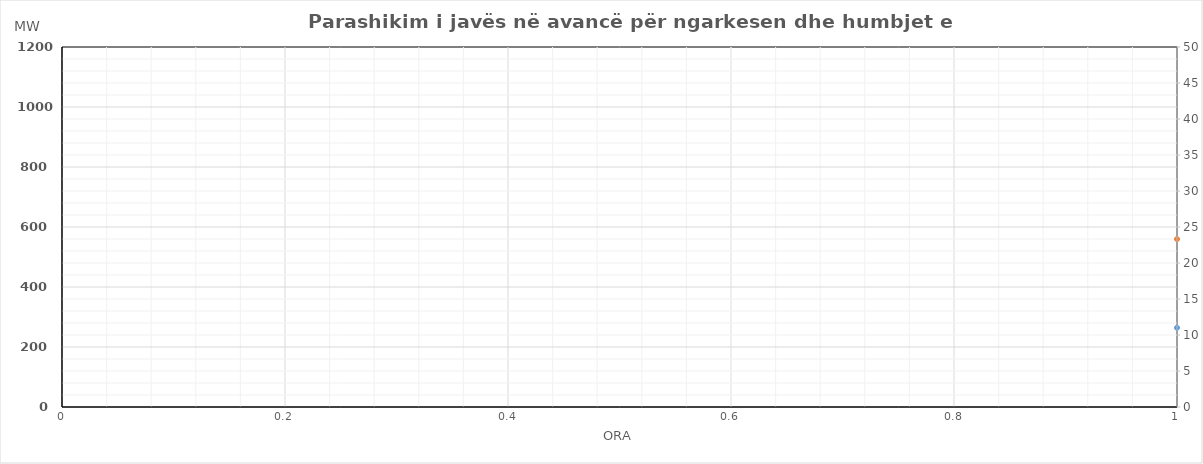
| Category | Ngarkesa (MWh) |
|---|---|
| 0 | 559.744 |
| 1 | 500.255 |
| 2 | 470.633 |
| 3 | 468.834 |
| 4 | 475.264 |
| 5 | 534.686 |
| 6 | 679.7 |
| 7 | 864.887 |
| 8 | 937.612 |
| 9 | 958.471 |
| 10 | 917.891 |
| 11 | 898.506 |
| 12 | 909.372 |
| 13 | 915.685 |
| 14 | 958.453 |
| 15 | 963.149 |
| 16 | 1028.243 |
| 17 | 1107.768 |
| 18 | 1094.482 |
| 19 | 1092.602 |
| 20 | 1050.593 |
| 21 | 959.44 |
| 22 | 822.235 |
| 23 | 681.222 |
| 24 | 555.702 |
| 25 | 504.362 |
| 26 | 474.074 |
| 27 | 466.372 |
| 28 | 492.708 |
| 29 | 550.149 |
| 30 | 697.971 |
| 31 | 875.694 |
| 32 | 945.855 |
| 33 | 973.934 |
| 34 | 931.85 |
| 35 | 909.347 |
| 36 | 897.888 |
| 37 | 924.164 |
| 38 | 961.08 |
| 39 | 958.004 |
| 40 | 1017.604 |
| 41 | 1075.795 |
| 42 | 1065.027 |
| 43 | 1044.728 |
| 44 | 1008.979 |
| 45 | 920.979 |
| 46 | 798.526 |
| 47 | 668.28 |
| 48 | 536.684 |
| 49 | 485.343 |
| 50 | 454.536 |
| 51 | 456.298 |
| 52 | 462.147 |
| 53 | 513.672 |
| 54 | 648.245 |
| 55 | 834.829 |
| 56 | 913.267 |
| 57 | 936.866 |
| 58 | 921.339 |
| 59 | 918.171 |
| 60 | 933.71 |
| 61 | 945.193 |
| 62 | 958.483 |
| 63 | 954.896 |
| 64 | 1000.634 |
| 65 | 1072.212 |
| 66 | 1055.405 |
| 67 | 1048.35 |
| 68 | 1011.768 |
| 69 | 921.642 |
| 70 | 783.425 |
| 71 | 654.639 |
| 72 | 555.175 |
| 73 | 495.274 |
| 74 | 471.297 |
| 75 | 467.653 |
| 76 | 475.588 |
| 77 | 533.4 |
| 78 | 677.307 |
| 79 | 858.611 |
| 80 | 930.502 |
| 81 | 950.628 |
| 82 | 914.556 |
| 83 | 891.739 |
| 84 | 902.189 |
| 85 | 909.853 |
| 86 | 940.378 |
| 87 | 945.636 |
| 88 | 1007.133 |
| 89 | 1086.471 |
| 90 | 1076.589 |
| 91 | 1069.175 |
| 92 | 1028.839 |
| 93 | 940.397 |
| 94 | 805.905 |
| 95 | 671.627 |
| 96 | 564.684 |
| 97 | 504.783 |
| 98 | 481.066 |
| 99 | 472.69 |
| 100 | 490.869 |
| 101 | 551.638 |
| 102 | 702.17 |
| 103 | 879.043 |
| 104 | 946.796 |
| 105 | 969.162 |
| 106 | 919.812 |
| 107 | 887.327 |
| 108 | 884.278 |
| 109 | 899.338 |
| 110 | 941.676 |
| 111 | 947.19 |
| 112 | 1015.619 |
| 113 | 1088.263 |
| 114 | 1081.4 |
| 115 | 1067.364 |
| 116 | 1027.445 |
| 117 | 940.066 |
| 118 | 813.455 |
| 119 | 678.448 |
| 120 | 559.744 |
| 121 | 500.255 |
| 122 | 470.633 |
| 123 | 468.834 |
| 124 | 475.264 |
| 125 | 534.686 |
| 126 | 679.7 |
| 127 | 864.887 |
| 128 | 937.612 |
| 129 | 958.471 |
| 130 | 917.891 |
| 131 | 898.506 |
| 132 | 909.372 |
| 133 | 915.685 |
| 134 | 958.453 |
| 135 | 963.149 |
| 136 | 1028.243 |
| 137 | 1107.768 |
| 138 | 1094.482 |
| 139 | 1092.602 |
| 140 | 1050.593 |
| 141 | 959.44 |
| 142 | 822.235 |
| 143 | 681.222 |
| 144 | 555.702 |
| 145 | 504.362 |
| 146 | 474.074 |
| 147 | 466.372 |
| 148 | 492.708 |
| 149 | 550.149 |
| 150 | 697.971 |
| 151 | 875.694 |
| 152 | 945.855 |
| 153 | 973.934 |
| 154 | 931.85 |
| 155 | 909.347 |
| 156 | 897.888 |
| 157 | 924.164 |
| 158 | 961.08 |
| 159 | 958.004 |
| 160 | 1017.604 |
| 161 | 1075.795 |
| 162 | 1065.027 |
| 163 | 1044.728 |
| 164 | 1008.979 |
| 165 | 920.979 |
| 166 | 798.526 |
| 167 | 668.28 |